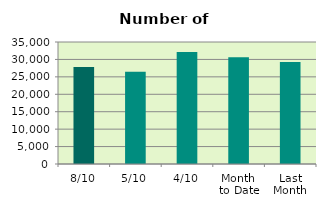
| Category | Series 0 |
|---|---|
| 8/10 | 27858 |
| 5/10 | 26472 |
| 4/10 | 32166 |
| Month 
to Date | 30598 |
| Last
Month | 29250.6 |